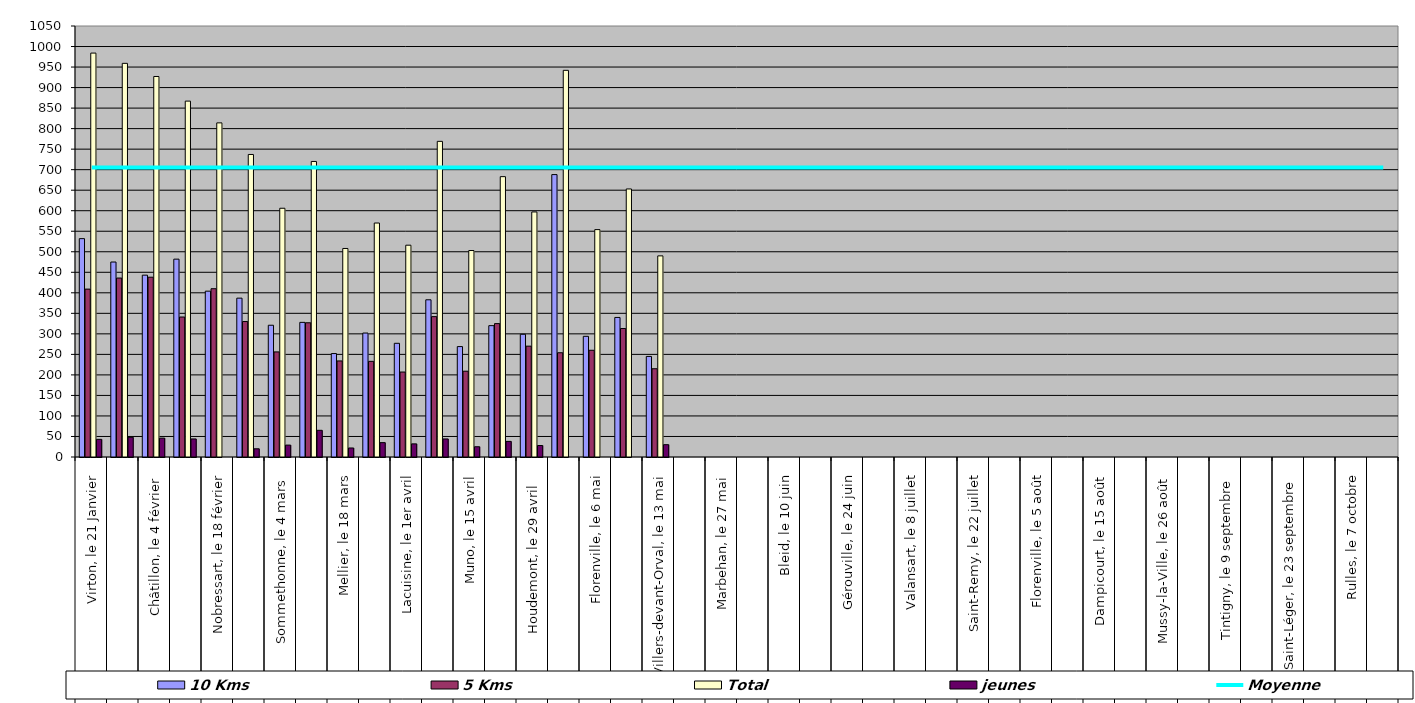
| Category | 10 Kms | 5 Kms | Total | jeunes |
|---|---|---|---|---|
| 0 | 532 | 409 | 984 | 43 |
| 1 | 475 | 436 | 959 | 48 |
| 2 | 443 | 438 | 927 | 46 |
| 3 | 482 | 341 | 867 | 44 |
| 4 | 404 | 410 | 814 | 0 |
| 5 | 387 | 330 | 737 | 20 |
| 6 | 321 | 256 | 606 | 29 |
| 7 | 328 | 327 | 720 | 65 |
| 8 | 252 | 234 | 508 | 22 |
| 9 | 302 | 233 | 570 | 35 |
| 10 | 277 | 207 | 516 | 32 |
| 11 | 383 | 342 | 769 | 44 |
| 12 | 269 | 209 | 503 | 25 |
| 13 | 320 | 325 | 683 | 38 |
| 14 | 299 | 270 | 597 | 28 |
| 15 | 688 | 254 | 942 | 0 |
| 16 | 294 | 260 | 554 | 0 |
| 17 | 340 | 313 | 653 | 0 |
| 18 | 245 | 215 | 490 | 30 |
| 19 | 0 | 0 | 0 | 0 |
| 20 | 0 | 0 | 0 | 0 |
| 21 | 0 | 0 | 0 | 0 |
| 22 | 0 | 0 | 0 | 0 |
| 23 | 0 | 0 | 0 | 0 |
| 24 | 0 | 0 | 0 | 0 |
| 25 | 0 | 0 | 0 | 0 |
| 26 | 0 | 0 | 0 | 0 |
| 27 | 0 | 0 | 0 | 0 |
| 28 | 0 | 0 | 0 | 0 |
| 29 | 0 | 0 | 0 | 0 |
| 30 | 0 | 0 | 0 | 0 |
| 31 | 0 | 0 | 0 | 0 |
| 32 | 0 | 0 | 0 | 0 |
| 33 | 0 | 0 | 0 | 0 |
| 34 | 0 | 0 | 0 | 0 |
| 35 | 0 | 0 | 0 | 0 |
| 36 | 0 | 0 | 0 | 0 |
| 37 | 0 | 0 | 0 | 0 |
| 38 | 0 | 0 | 0 | 0 |
| 39 | 0 | 0 | 0 | 0 |
| 40 | 0 | 0 | 0 | 0 |
| 41 | 0 | 0 | 0 | 0 |